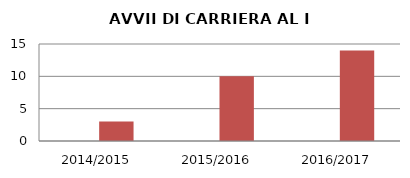
| Category | ANNO | NUMERO |
|---|---|---|
| 2014/2015 | 0 | 3 |
| 2015/2016 | 0 | 10 |
| 2016/2017 | 0 | 14 |